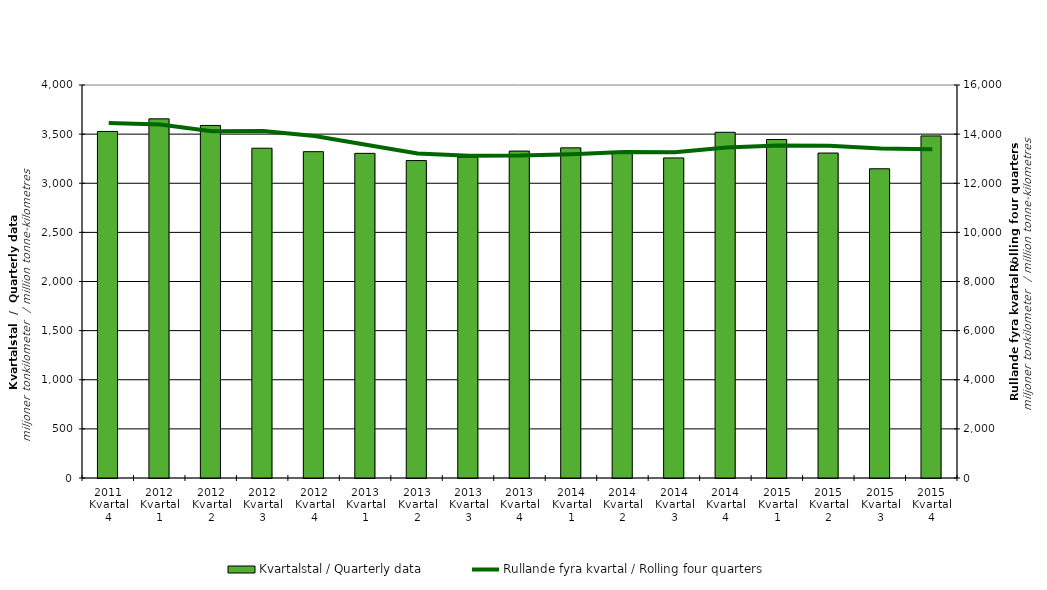
| Category | Kvartalstal / Quarterly data |
|---|---|
| 2011 Kvartal 4 | 3527.274 |
| 2012 Kvartal 1 | 3655.499 |
| 2012 Kvartal 2 | 3588.32 |
| 2012 Kvartal 3 | 3356.478 |
| 2012 Kvartal 4 | 3321.309 |
| 2013 Kvartal 1 | 3304.246 |
| 2013 Kvartal 2 | 3230.749 |
| 2013 Kvartal 3 | 3266.245 |
| 2013 Kvartal 4 | 3327.51 |
| 2014 Kvartal 1 | 3360.327 |
| 2014 Kvartal 2 | 3318.946 |
| 2014 Kvartal 3 | 3257.731 |
| 2014 Kvartal 4 | 3518.717 |
| 2015 Kvartal 1 | 3445.415 |
| 2015 Kvartal 2 | 3307.552 |
| 2015 Kvartal 3 | 3147.377 |
| 2015 Kvartal 4 | 3481.621 |